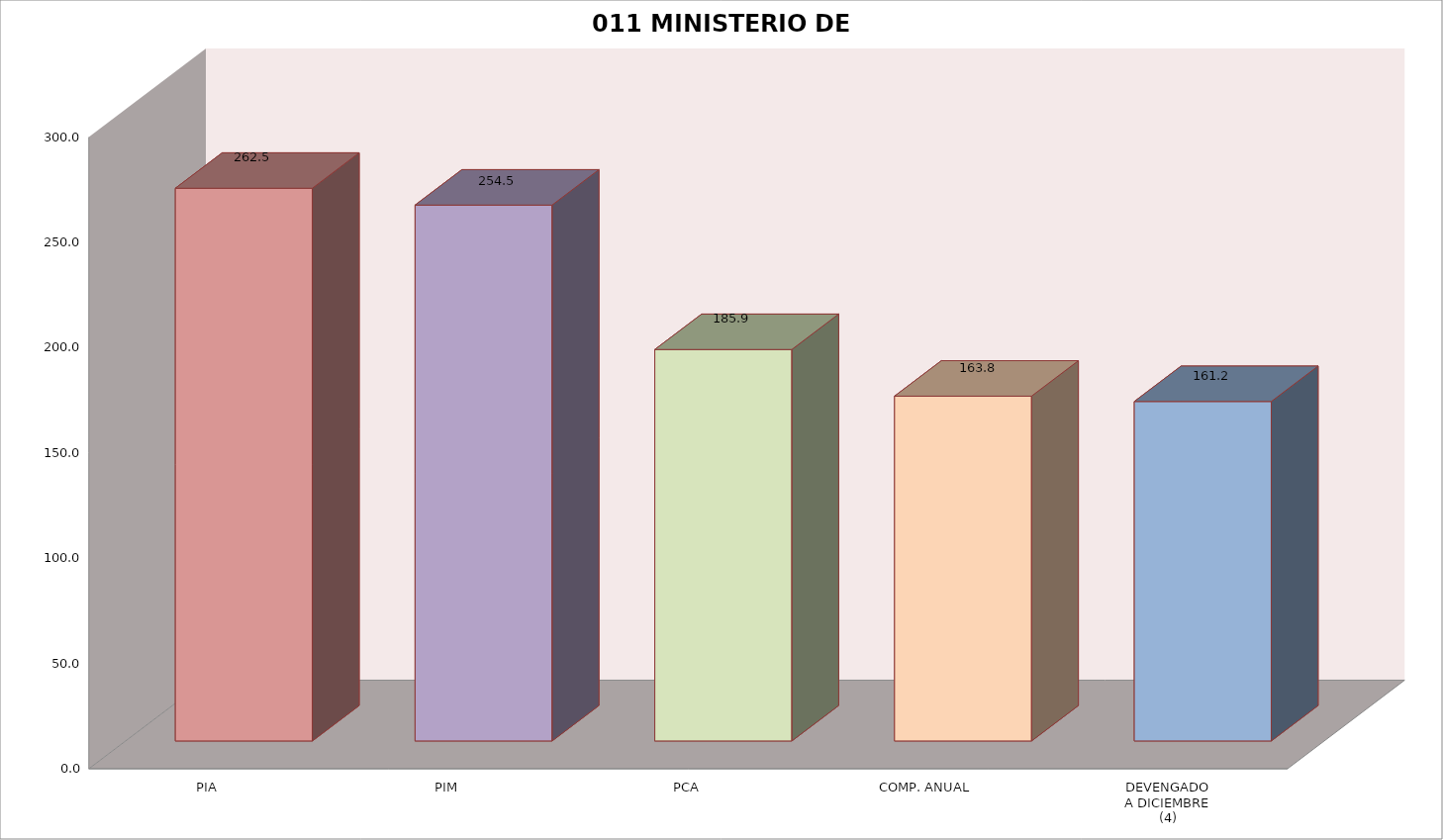
| Category | 011 MINISTERIO DE SALUD |
|---|---|
| PIA | 262.508 |
| PIM | 254.515 |
| PCA | 185.915 |
| COMP. ANUAL | 163.774 |
| DEVENGADO
A DICIEMBRE
(4) | 161.225 |